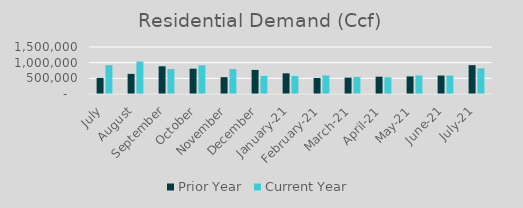
| Category | Prior Year | Current Year |
|---|---|---|
| July | 512849.55 | 920418.723 |
| August | 641515.25 | 1034271.241 |
| September | 884745.885 | 795392.365 |
| October | 808030.57 | 913450.318 |
| November | 537591.016 | 796803.85 |
| December | 768795.205 | 575698.992 |
| January-21 | 659359.876 | 574964.407 |
| February-21 | 510296.309 | 591912.627 |
| March-21 | 521598.856 | 545392.69 |
| April-21 | 552550.404 | 533967.423 |
| May-21 | 561680.927 | 591911.753 |
| June-21 | 588815.728 | 587861.265 |
| July-21 | 920418.723 | 816546.945 |